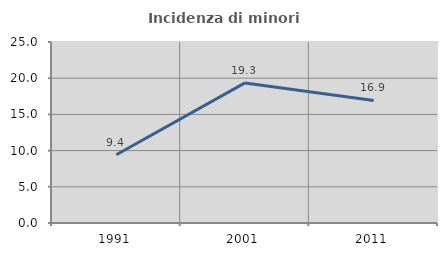
| Category | Incidenza di minori stranieri |
|---|---|
| 1991.0 | 9.424 |
| 2001.0 | 19.347 |
| 2011.0 | 16.93 |